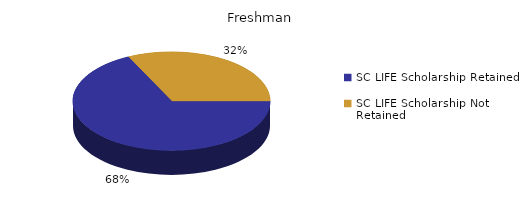
| Category | Freshman |
|---|---|
| SC LIFE Scholarship Retained  | 1326 |
| SC LIFE Scholarship Not Retained  | 631 |